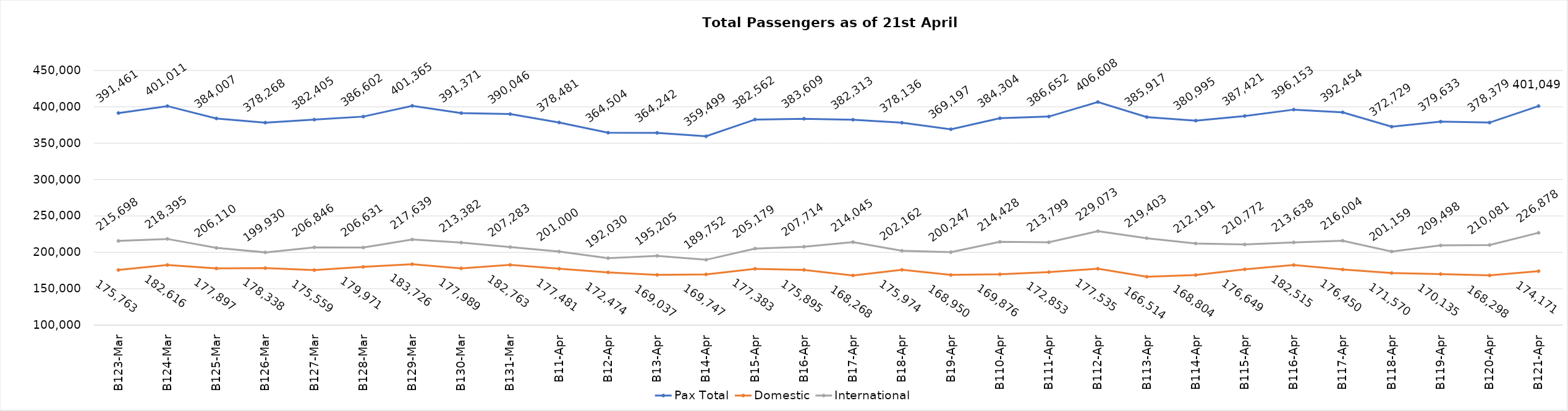
| Category | Pax Total | Domestic | International |
|---|---|---|---|
| 2024-03-23 | 391461 | 175763 | 215698 |
| 2024-03-24 | 401011 | 182616 | 218395 |
| 2024-03-25 | 384007 | 177897 | 206110 |
| 2024-03-26 | 378268 | 178338 | 199930 |
| 2024-03-27 | 382405 | 175559 | 206846 |
| 2024-03-28 | 386602 | 179971 | 206631 |
| 2024-03-29 | 401365 | 183726 | 217639 |
| 2024-03-30 | 391371 | 177989 | 213382 |
| 2024-03-31 | 390046 | 182763 | 207283 |
| 2024-04-01 | 378481 | 177481 | 201000 |
| 2024-04-02 | 364504 | 172474 | 192030 |
| 2024-04-03 | 364242 | 169037 | 195205 |
| 2024-04-04 | 359499 | 169747 | 189752 |
| 2024-04-05 | 382562 | 177383 | 205179 |
| 2024-04-06 | 383609 | 175895 | 207714 |
| 2024-04-07 | 382313 | 168268 | 214045 |
| 2024-04-08 | 378136 | 175974 | 202162 |
| 2024-04-09 | 369197 | 168950 | 200247 |
| 2024-04-10 | 384304 | 169876 | 214428 |
| 2024-04-11 | 386652 | 172853 | 213799 |
| 2024-04-12 | 406608 | 177535 | 229073 |
| 2024-04-13 | 385917 | 166514 | 219403 |
| 2024-04-14 | 380995 | 168804 | 212191 |
| 2024-04-15 | 387421 | 176649 | 210772 |
| 2024-04-16 | 396153 | 182515 | 213638 |
| 2024-04-17 | 392454 | 176450 | 216004 |
| 2024-04-18 | 372729 | 171570 | 201159 |
| 2024-04-19 | 379633 | 170135 | 209498 |
| 2024-04-20 | 378379 | 168298 | 210081 |
| 2024-04-21 | 401049 | 174171 | 226878 |